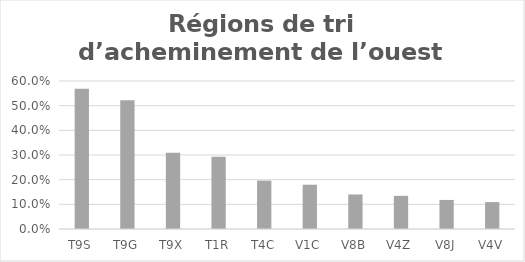
| Category | Series 0 |
|---|---|
| T9S | 0.568 |
| T9G | 0.522 |
| T9X | 0.309 |
| T1R | 0.293 |
| T4C | 0.196 |
| V1C | 0.179 |
| V8B | 0.14 |
| V4Z | 0.134 |
| V8J | 0.118 |
| V4V | 0.109 |